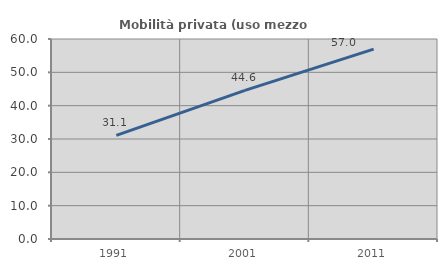
| Category | Mobilità privata (uso mezzo privato) |
|---|---|
| 1991.0 | 31.072 |
| 2001.0 | 44.589 |
| 2011.0 | 56.964 |